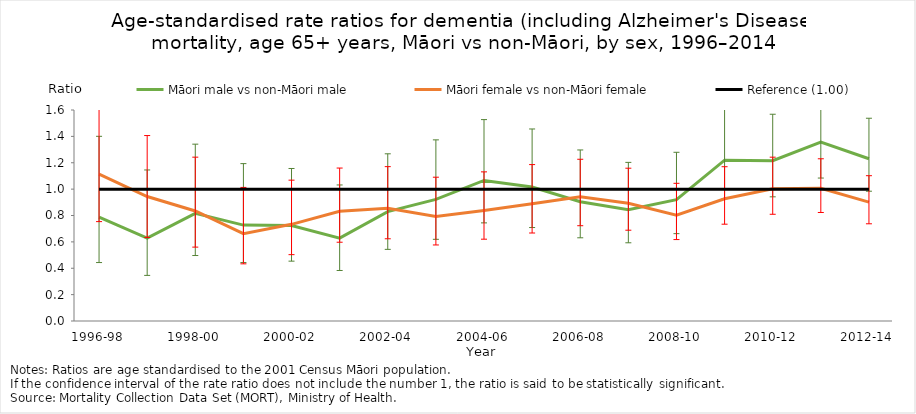
| Category | Māori male vs non-Māori male | Māori female vs non-Māori female | Reference (1.00) |
|---|---|---|---|
| 1996-98 | 0.788 | 1.114 | 1 |
| 1997-99 | 0.629 | 0.944 | 1 |
| 1998-00 | 0.816 | 0.834 | 1 |
| 1999-01 | 0.727 | 0.663 | 1 |
| 2000-02 | 0.724 | 0.733 | 1 |
| 2001-03 | 0.629 | 0.832 | 1 |
| 2002-04 | 0.83 | 0.854 | 1 |
| 2003-05 | 0.922 | 0.793 | 1 |
| 2004-06 | 1.066 | 0.838 | 1 |
| 2005-07 | 1.016 | 0.89 | 1 |
| 2006-08 | 0.905 | 0.941 | 1 |
| 2007-09 | 0.845 | 0.893 | 1 |
| 2008-10 | 0.921 | 0.803 | 1 |
| 2009-11 | 1.219 | 0.927 | 1 |
| 2010-12 | 1.215 | 1.003 | 1 |
| 2011-13 | 1.357 | 1.006 | 1 |
| 2012-14 | 1.23 | 0.901 | 1 |